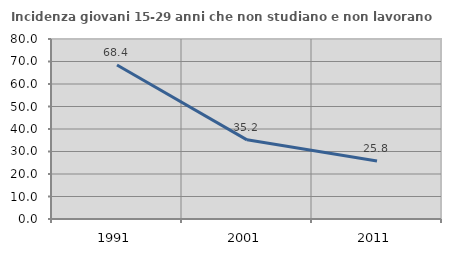
| Category | Incidenza giovani 15-29 anni che non studiano e non lavorano  |
|---|---|
| 1991.0 | 68.421 |
| 2001.0 | 35.187 |
| 2011.0 | 25.782 |